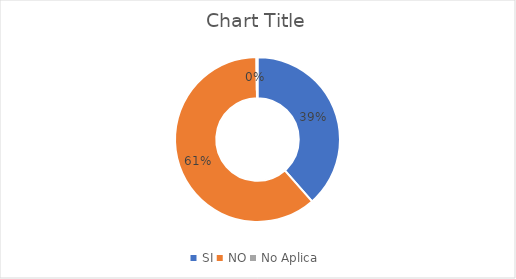
| Category | Series 0 |
|---|---|
| SI | 0.385 |
| NO | 0.613 |
| No Aplica | 0.002 |